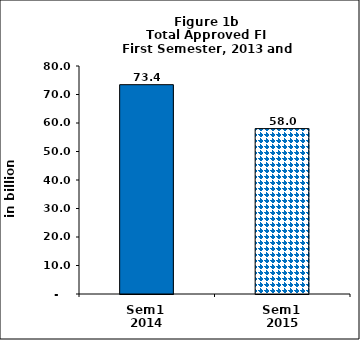
| Category | Series 0 |
|---|---|
| Sem1 
2014 | 73.444 |
| Sem1 
2015 | 58.027 |